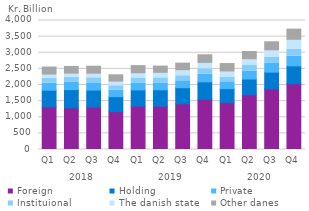
| Category | Foreign | Holding | Private | Instituional  | The danish state | Other danes |
|---|---|---|---|---|---|---|
| 0 | 1321.814 | 516.743 | 217.231 | 148.881 | 100.121 | 252.139 |
| 1 | 1289.976 | 566.59 | 223.297 | 154.966 | 99.059 | 242.019 |
| 2 | 1313.494 | 528.238 | 223.142 | 158.151 | 109.609 | 249.521 |
| 3 | 1175.011 | 463.526 | 195.783 | 143.417 | 109.353 | 228.696 |
| 4 | 1344.303 | 503.131 | 216.089 | 155.85 | 125.29 | 256.828 |
| 5 | 1342.616 | 508.983 | 213.239 | 157.545 | 138.421 | 226.077 |
| 6 | 1416.257 | 499.623 | 215.218 | 156.634 | 152.741 | 236.745 |
| 7 | 1557.556 | 541.319 | 234.397 | 171.653 | 163.772 | 269.102 |
| 8 | 1455.648 | 430.805 | 213.266 | 142.935 | 157.399 | 265.319 |
| 9 | 1698.089 | 487.71 | 248.622 | 169.344 | 176.07 | 258.156 |
| 10 | 1878.092 | 520.332 | 271.116 | 188.773 | 199.175 | 282.512 |
| 11 | 2041.734 | 551.951 | 298.643 | 213.138 | 279.014 | 348.352 |